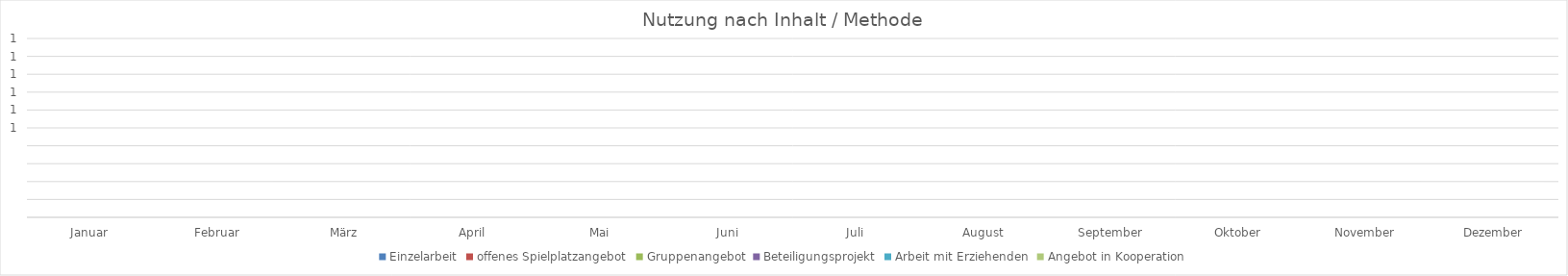
| Category | Einzelarbeit | offenes Spielplatzangebot | Gruppenangebot | Beteiligungsprojekt | Arbeit mit Erziehenden | Angebot in Kooperation |
|---|---|---|---|---|---|---|
| Januar | 0 | 0 | 0 | 0 | 0 | 0 |
| Februar | 0 | 0 | 0 | 0 | 0 | 0 |
| März | 0 | 0 | 0 | 0 | 0 | 0 |
| April | 0 | 0 | 0 | 0 | 0 | 0 |
| Mai | 0 | 0 | 0 | 0 | 0 | 0 |
| Juni | 0 | 0 | 0 | 0 | 0 | 0 |
| Juli | 0 | 0 | 0 | 0 | 0 | 0 |
| August | 0 | 0 | 0 | 0 | 0 | 0 |
| September | 0 | 0 | 0 | 0 | 0 | 0 |
| Oktober | 0 | 0 | 0 | 0 | 0 | 0 |
| November | 0 | 0 | 0 | 0 | 0 | 0 |
| Dezember | 0 | 0 | 0 | 0 | 0 | 0 |